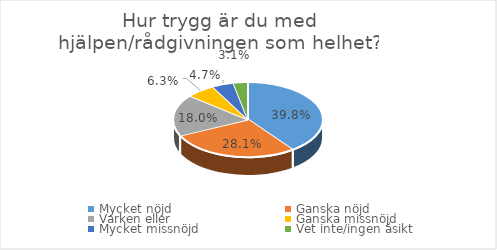
| Category | Series 0 |
|---|---|
| Mycket nöjd  | 0.398 |
| Ganska nöjd | 0.281 |
| Varken eller  | 0.18 |
| Ganska missnöjd | 0.062 |
| Mycket missnöjd  | 0.047 |
| Vet inte/ingen åsikt | 0.031 |